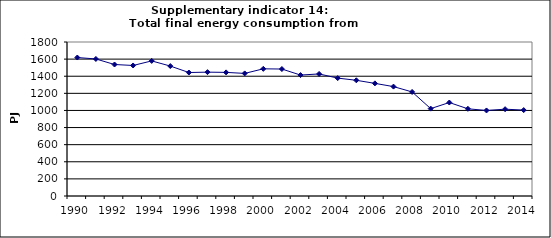
| Category | Total final energy consumption from industry, PJ |
|---|---|
| 1990 | 1618.6 |
| 1991 | 1601.732 |
| 1992 | 1536.999 |
| 1993 | 1525.662 |
| 1994 | 1578.897 |
| 1995 | 1518.823 |
| 1996 | 1443.198 |
| 1997 | 1447.69 |
| 1998 | 1444.955 |
| 1999 | 1432.801 |
| 2000 | 1486.572 |
| 2001 | 1483.912 |
| 2002 | 1413.626 |
| 2003 | 1426.618 |
| 2004 | 1377.978 |
| 2005 | 1352.47 |
| 2006 | 1316.422 |
| 2007 | 1278.661 |
| 2008 | 1216.382 |
| 2009 | 1021.115 |
| 2010 | 1092.654 |
| 2011 | 1019.244 |
| 2012 | 999.745 |
| 2013 | 1014.712 |
| 2014 | 1004.258 |